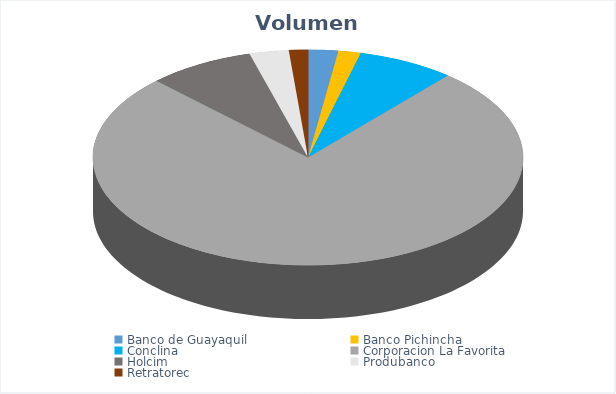
| Category | VOLUMEN ($USD) |
|---|---|
| Banco de Guayaquil | 3987.48 |
| Banco Pichincha | 2970 |
| Conclina | 12896 |
| Corporacion La Favorita | 134982.33 |
| Holcim | 14200 |
| Produbanco | 5222.65 |
| Retratorec | 2515.2 |